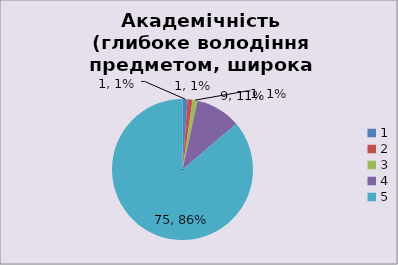
| Category | Кількість | % |
|---|---|---|
| 0 | 1 | 0.011 |
| 1 | 1 | 0.011 |
| 2 | 1 | 0.011 |
| 3 | 9 | 0.103 |
| 4 | 75 | 0.862 |